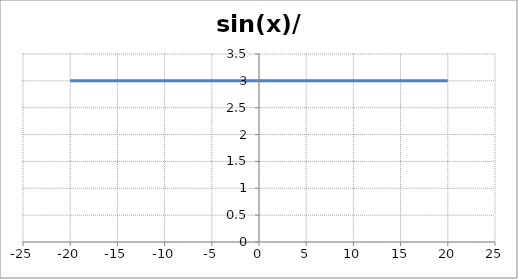
| Category | sin(x)/x |
|---|---|
| -20.0 | 0.046 |
| -19.6 | 0.035 |
| -19.200000000000003 | 0.018 |
| -18.800000000000004 | -0.003 |
| -18.400000000000006 | -0.024 |
| -18.000000000000007 | -0.042 |
| -17.60000000000001 | -0.054 |
| -17.20000000000001 | -0.058 |
| -16.80000000000001 | -0.053 |
| -16.400000000000013 | -0.039 |
| -16.000000000000014 | -0.018 |
| -15.600000000000014 | 0.007 |
| -15.200000000000014 | 0.032 |
| -14.800000000000013 | 0.053 |
| -14.400000000000013 | 0.067 |
| -14.000000000000012 | 0.071 |
| -13.600000000000012 | 0.063 |
| -13.200000000000012 | 0.045 |
| -12.800000000000011 | 0.018 |
| -12.400000000000011 | -0.013 |
| -12.00000000000001 | -0.045 |
| -11.60000000000001 | -0.071 |
| -11.20000000000001 | -0.087 |
| -10.80000000000001 | -0.091 |
| -10.40000000000001 | -0.08 |
| -10.000000000000009 | -0.054 |
| -9.600000000000009 | -0.018 |
| -9.200000000000008 | 0.024 |
| -8.800000000000008 | 0.066 |
| -8.400000000000007 | 0.102 |
| -8.000000000000007 | 0.124 |
| -7.600000000000007 | 0.127 |
| -7.200000000000006 | 0.11 |
| -6.800000000000006 | 0.073 |
| -6.400000000000006 | 0.018 |
| -6.000000000000005 | -0.047 |
| -5.600000000000005 | -0.113 |
| -5.200000000000005 | -0.17 |
| -4.800000000000004 | -0.208 |
| -4.400000000000004 | -0.216 |
| -4.0000000000000036 | -0.189 |
| -3.6000000000000036 | -0.123 |
| -3.2000000000000037 | -0.018 |
| -2.800000000000004 | 0.12 |
| -2.400000000000004 | 0.281 |
| -2.000000000000004 | 0.455 |
| -1.600000000000004 | 0.625 |
| -1.2000000000000042 | 0.777 |
| -0.8000000000000042 | 0.897 |
| -0.40000000000000413 | 0.974 |
| -4.107825191113079e-15 | 1 |
| 0.3999999999999959 | 0.974 |
| 0.7999999999999959 | 0.897 |
| 1.199999999999996 | 0.777 |
| 1.599999999999996 | 0.625 |
| 1.999999999999996 | 0.455 |
| 2.399999999999996 | 0.281 |
| 2.799999999999996 | 0.12 |
| 3.1999999999999957 | -0.018 |
| 3.5999999999999956 | -0.123 |
| 3.9999999999999956 | -0.189 |
| 4.399999999999996 | -0.216 |
| 4.799999999999996 | -0.208 |
| 5.199999999999997 | -0.17 |
| 5.599999999999997 | -0.113 |
| 5.999999999999997 | -0.047 |
| 6.399999999999998 | 0.018 |
| 6.799999999999998 | 0.073 |
| 7.199999999999998 | 0.11 |
| 7.599999999999999 | 0.127 |
| 7.999999999999999 | 0.124 |
| 8.399999999999999 | 0.102 |
| 8.799999999999999 | 0.066 |
| 9.2 | 0.024 |
| 9.6 | -0.018 |
| 10.0 | -0.054 |
| 10.4 | -0.08 |
| 10.8 | -0.091 |
| 11.200000000000001 | -0.087 |
| 11.600000000000001 | -0.071 |
| 12.000000000000002 | -0.045 |
| 12.400000000000002 | -0.013 |
| 12.800000000000002 | 0.018 |
| 13.200000000000003 | 0.045 |
| 13.600000000000003 | 0.063 |
| 14.000000000000004 | 0.071 |
| 14.400000000000004 | 0.067 |
| 14.800000000000004 | 0.053 |
| 15.200000000000005 | 0.032 |
| 15.600000000000005 | 0.007 |
| 16.000000000000004 | -0.018 |
| 16.400000000000002 | -0.039 |
| 16.8 | -0.053 |
| 17.2 | -0.058 |
| 17.599999999999998 | -0.054 |
| 17.999999999999996 | -0.042 |
| 18.399999999999995 | -0.024 |
| 18.799999999999994 | -0.003 |
| 19.199999999999992 | 0.018 |
| 19.59999999999999 | 0.035 |
| 19.99999999999999 | 0.046 |